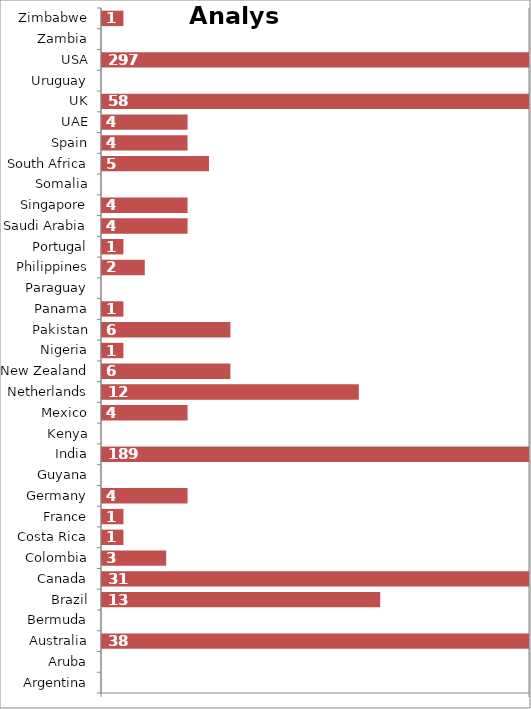
| Category | Analyst |
|---|---|
| Argentina | 0 |
| Aruba | 0 |
| Australia | 38 |
| Bermuda | 0 |
| Brazil | 13 |
| Canada | 31 |
| Colombia | 3 |
| Costa Rica | 1 |
| France | 1 |
| Germany | 4 |
| Guyana | 0 |
| India | 189 |
| Kenya | 0 |
| Mexico | 4 |
| Netherlands | 12 |
| New Zealand | 6 |
| Nigeria | 1 |
| Pakistan | 6 |
| Panama | 1 |
| Paraguay | 0 |
| Philippines | 2 |
| Portugal | 1 |
| Saudi Arabia | 4 |
| Singapore | 4 |
| Somalia | 0 |
| South Africa | 5 |
| Spain | 4 |
| UAE | 4 |
| UK | 58 |
| Uruguay | 0 |
| USA | 297 |
| Zambia | 0 |
| Zimbabwe | 1 |